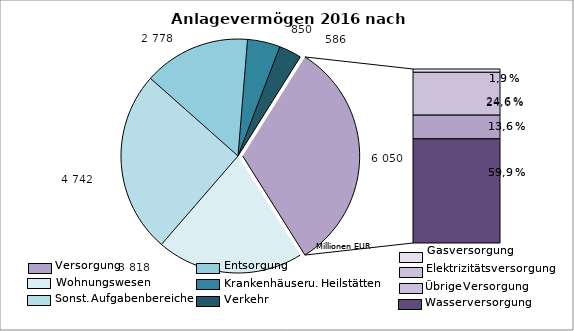
| Category | Series 0 |
|---|---|
| Wohnungsunternehmen | 3818 |
| sonstige Aufgabenbereiche | 4742 |
| Entsorgungsunternehmen | 2778 |
| Krankenhäuser | 850 |
| Verkehrsunternehmen | 586 |
| Gas | 115 |
| Elektrizität | 1490 |
| Kombinierte Unternehmen | 823 |
| Wasser | 3622 |